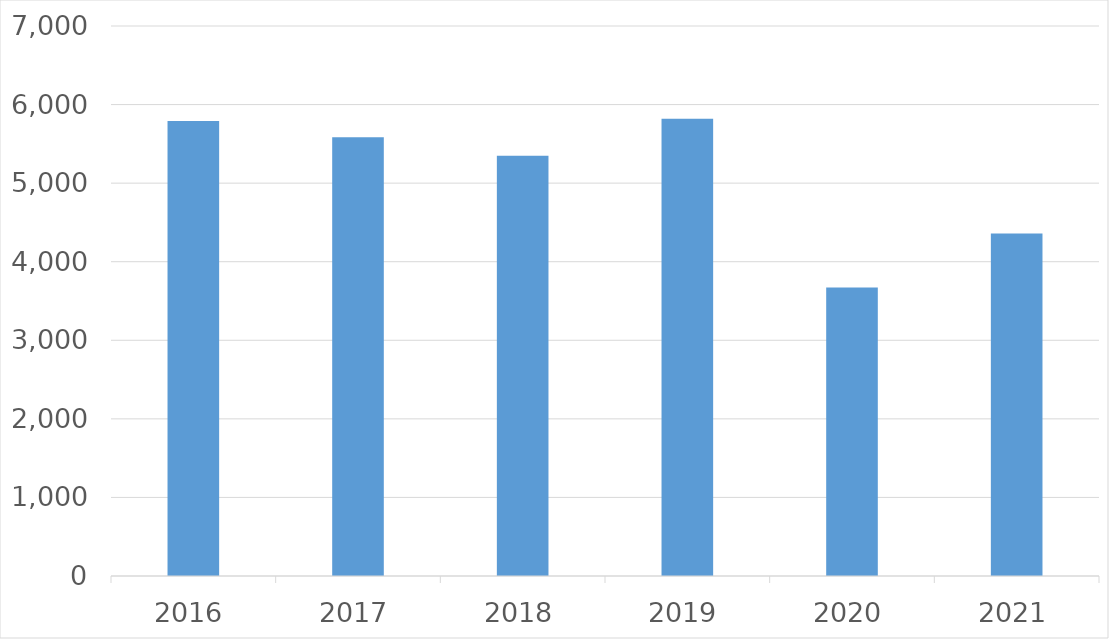
| Category | Series 0 |
|---|---|
| 2016 | 5792 |
| 2017 | 5584 |
| 2018 | 5349 |
| 2019 | 5819 |
| 2020 | 3671 |
| 2021 | 4358 |